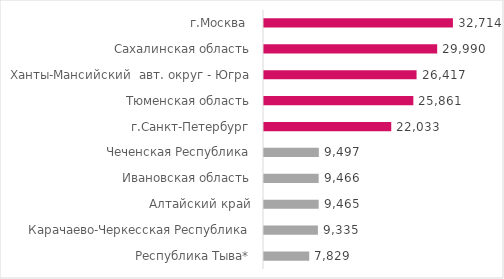
| Category | Средние ежемесячные выплаты со вклада, руб |
|---|---|
| Республика Тыва* | 7829.417 |
| Карачаево-Черкесская Республика | 9335.229 |
| Алтайский край | 9464.807 |
| Ивановская область | 9465.899 |
| Чеченская Республика | 9496.632 |
| г.Санкт-Петербург | 22032.969 |
| Тюменская область | 25860.897 |
| Ханты-Мансийский  авт. округ - Югра | 26417.085 |
| Сахалинская область | 29990.153 |
| г.Москва  | 32714.453 |